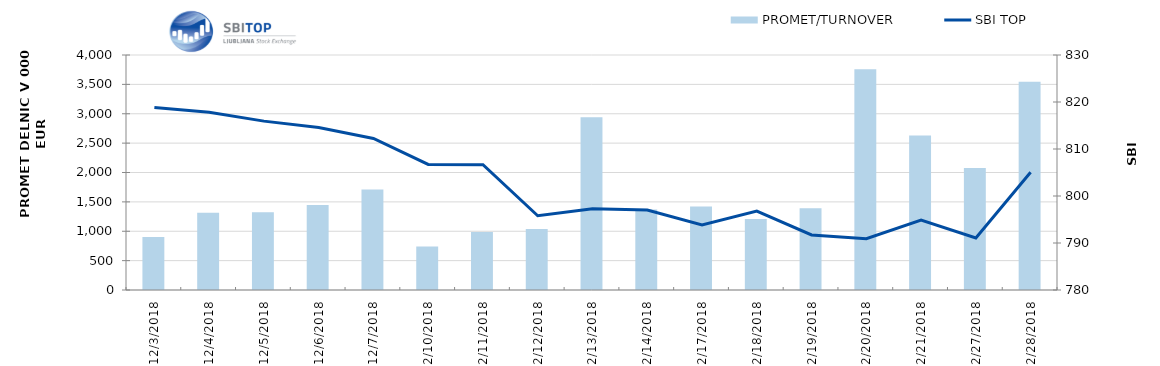
| Category | PROMET/TURNOVER |
|---|---|
| 12/3/18 | 904 |
| 12/4/18 | 1317 |
| 12/5/18 | 1324 |
| 12/6/18 | 1445 |
| 12/7/18 | 1710 |
| 12/10/18 | 742 |
| 12/11/18 | 989 |
| 12/12/18 | 1038 |
| 12/13/18 | 2942 |
| 12/14/18 | 1372 |
| 12/17/18 | 1420 |
| 12/18/18 | 1207 |
| 12/19/18 | 1392 |
| 12/20/18 | 3758 |
| 12/21/18 | 2631 |
| 12/27/18 | 2078 |
| 12/28/18 | 3544 |